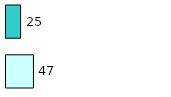
| Category | Series 0 | Series 1 |
|---|---|---|
| 0 | 47 | 25 |